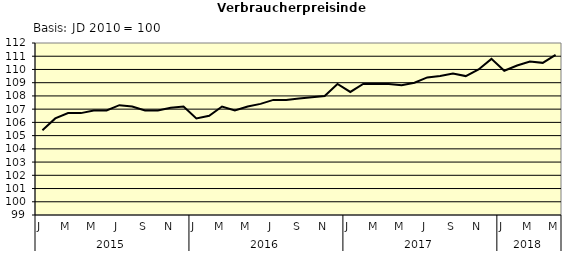
| Category | Series 0 |
|---|---|
| 0 | 105.4 |
| 1 | 106.3 |
| 2 | 106.7 |
| 3 | 106.7 |
| 4 | 106.9 |
| 5 | 106.9 |
| 6 | 107.3 |
| 7 | 107.2 |
| 8 | 106.9 |
| 9 | 106.9 |
| 10 | 107.1 |
| 11 | 107.2 |
| 12 | 106.3 |
| 13 | 106.5 |
| 14 | 107.2 |
| 15 | 106.9 |
| 16 | 107.2 |
| 17 | 107.4 |
| 18 | 107.7 |
| 19 | 107.7 |
| 20 | 107.8 |
| 21 | 107.9 |
| 22 | 108 |
| 23 | 108.9 |
| 24 | 108.3 |
| 25 | 108.9 |
| 26 | 108.9 |
| 27 | 108.9 |
| 28 | 108.8 |
| 29 | 109 |
| 30 | 109.4 |
| 31 | 109.5 |
| 32 | 109.7 |
| 33 | 109.5 |
| 34 | 110 |
| 35 | 110.8 |
| 36 | 109.9 |
| 37 | 110.3 |
| 38 | 110.6 |
| 39 | 110.5 |
| 40 | 111.1 |